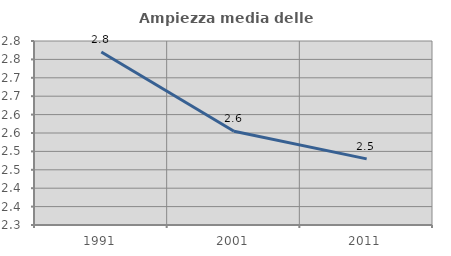
| Category | Ampiezza media delle famiglie |
|---|---|
| 1991.0 | 2.77 |
| 2001.0 | 2.555 |
| 2011.0 | 2.48 |